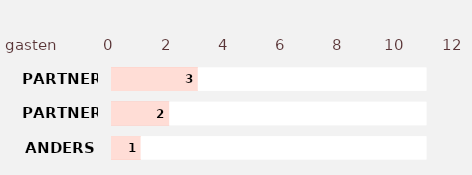
| Category | Series 2 | Series 3 | Series 1 | Series 0 |
|---|---|---|---|---|
| ANDERS | 11 | 1 | 11 | 1 |
| PARTNER 2 | 11 | 2 | 11 | 2 |
| PARTNER 1 | 11 | 3 | 11 | 3 |